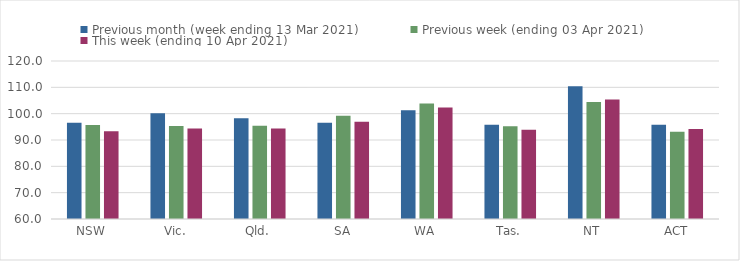
| Category | Previous month (week ending 13 Mar 2021) | Previous week (ending 03 Apr 2021) | This week (ending 10 Apr 2021) |
|---|---|---|---|
| NSW | 96.51 | 95.71 | 93.28 |
| Vic. | 100.17 | 95.32 | 94.4 |
| Qld. | 98.3 | 95.44 | 94.38 |
| SA | 96.53 | 99.24 | 96.92 |
| WA | 101.34 | 103.88 | 102.38 |
| Tas. | 95.8 | 95.18 | 93.85 |
| NT | 110.37 | 104.46 | 105.41 |
| ACT | 95.81 | 93.18 | 94.18 |